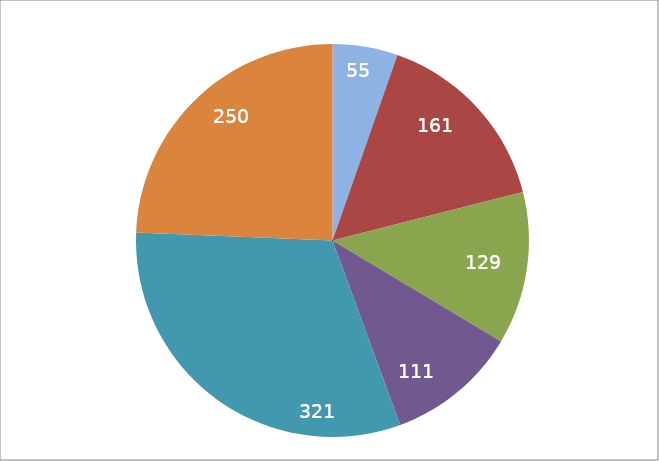
| Category | Series 1 |
|---|---|
| 0 | 55 |
| 1 | 161 |
| 2 | 129 |
| 3 | 111 |
| 4 | 321 |
| 5 | 250 |